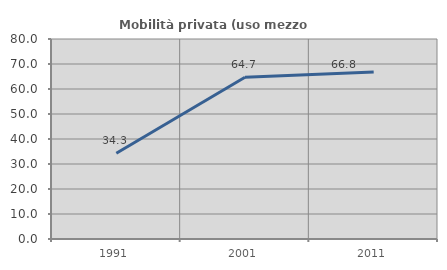
| Category | Mobilità privata (uso mezzo privato) |
|---|---|
| 1991.0 | 34.286 |
| 2001.0 | 64.706 |
| 2011.0 | 66.827 |